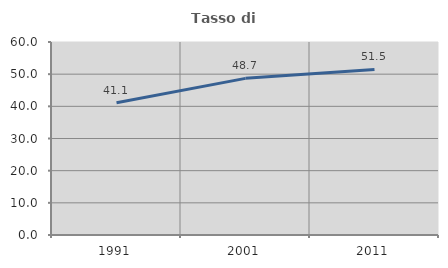
| Category | Tasso di occupazione   |
|---|---|
| 1991.0 | 41.128 |
| 2001.0 | 48.693 |
| 2011.0 | 51.455 |